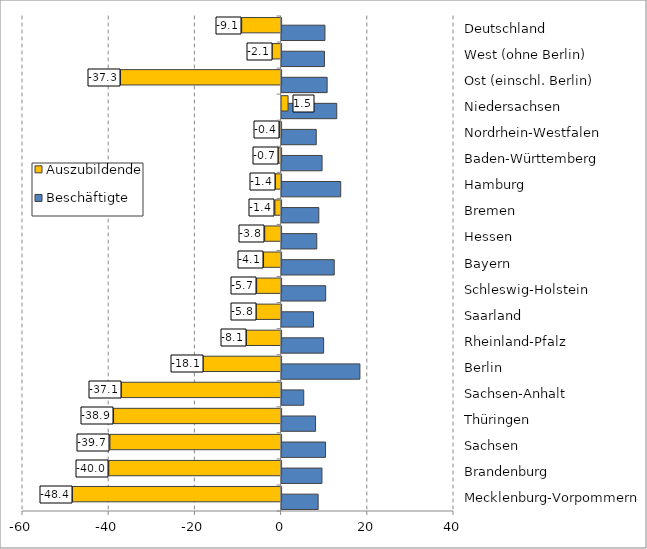
| Category | Beschäftigte | Auszubildende |
|---|---|---|
| Mecklenburg-Vorpommern | 8.481 | -48.429 |
| Brandenburg | 9.364 | -39.97 |
| Sachsen | 10.202 | -39.708 |
| Thüringen | 7.881 | -38.865 |
| Sachsen-Anhalt | 5.136 | -37.096 |
| Berlin | 18.172 | -18.117 |
| Rheinland-Pfalz | 9.753 | -8.06 |
| Saarland | 7.406 | -5.819 |
| Schleswig-Holstein | 10.232 | -5.666 |
| Bayern | 12.213 | -4.07 |
| Hessen | 8.161 | -3.794 |
| Bremen | 8.635 | -1.425 |
| Hamburg | 13.72 | -1.36 |
| Baden-Württemberg | 9.391 | -0.688 |
| Nordrhein-Westfalen | 8.043 | -0.445 |
| Niedersachsen | 12.798 | 1.502 |
| Ost (einschl. Berlin) | 10.565 | -37.263 |
| West (ohne Berlin) | 9.95 | -2.103 |
| Deutschland | 10.057 | -9.14 |